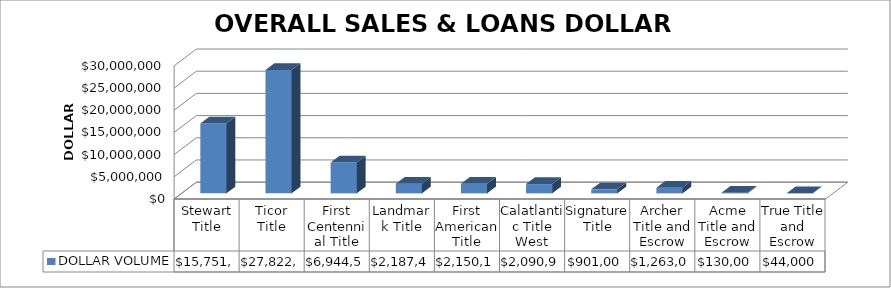
| Category | DOLLAR VOLUME |
|---|---|
| Stewart Title | 15751852 |
| Ticor Title | 27822234.33 |
| First Centennial Title | 6944584 |
| Landmark Title | 2187468 |
| First American Title | 2150164 |
| Calatlantic Title West | 2090907 |
| Signature Title | 901000 |
| Archer Title and Escrow | 1263000 |
| Acme Title and Escrow | 130000 |
| True Title and Escrow | 44000 |